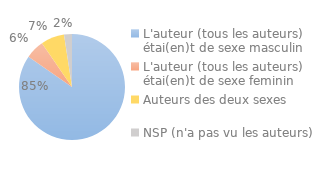
| Category | Series 0 |
|---|---|
| L'auteur (tous les auteurs) étai(en)t de sexe masculin | 0.847 |
| L'auteur (tous les auteurs) étai(en)t de sexe feminin | 0.057 |
| Auteurs des deux sexes | 0.072 |
| NSP (n'a pas vu les auteurs) | 0.024 |